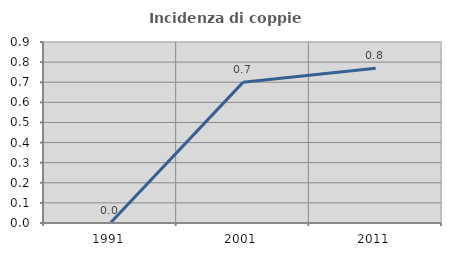
| Category | Incidenza di coppie miste |
|---|---|
| 1991.0 | 0 |
| 2001.0 | 0.699 |
| 2011.0 | 0.769 |